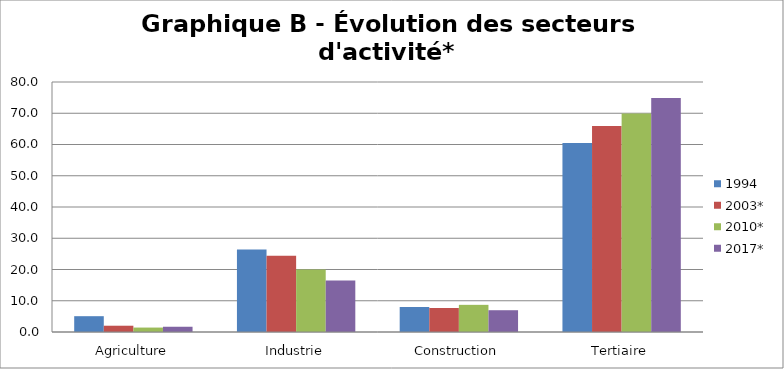
| Category | 1994 | 2003* | 2010* | 2017* |
|---|---|---|---|---|
| Agriculture | 5.06 | 2.01 | 1.42 | 1.68 |
| Industrie | 26.43 | 24.39 | 19.99 | 16.51 |
| Construction | 8.01 | 7.69 | 8.69 | 6.97 |
| Tertiaire | 60.47 | 65.92 | 69.9 | 74.85 |